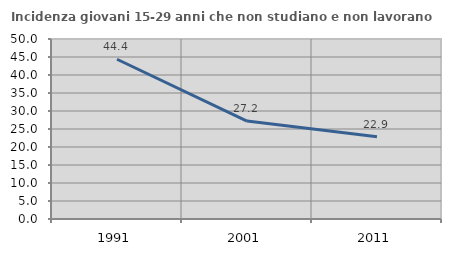
| Category | Incidenza giovani 15-29 anni che non studiano e non lavorano  |
|---|---|
| 1991.0 | 44.379 |
| 2001.0 | 27.2 |
| 2011.0 | 22.857 |